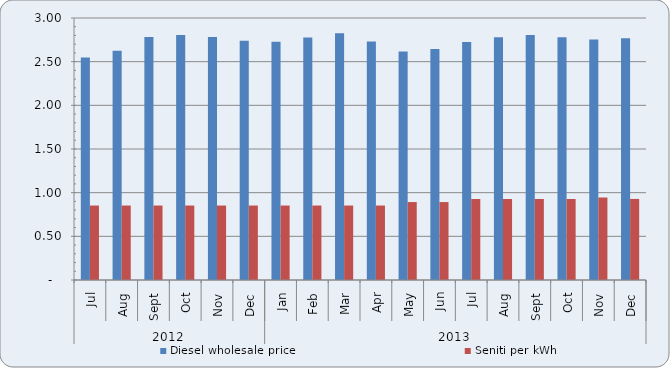
| Category | Diesel wholesale price | Seniti per kWh |
|---|---|---|
| 0 | 2.547 | 0.853 |
| 1 | 2.626 | 0.853 |
| 2 | 2.781 | 0.853 |
| 3 | 2.806 | 0.853 |
| 4 | 2.782 | 0.853 |
| 5 | 2.738 | 0.853 |
| 6 | 2.729 | 0.853 |
| 7 | 2.778 | 0.853 |
| 8 | 2.824 | 0.853 |
| 9 | 2.731 | 0.853 |
| 10 | 2.617 | 0.892 |
| 11 | 2.644 | 0.892 |
| 12 | 2.725 | 0.927 |
| 13 | 2.78 | 0.927 |
| 14 | 2.805 | 0.927 |
| 15 | 2.781 | 0.927 |
| 16 | 2.755 | 0.944 |
| 17 | 2.768 | 0.928 |